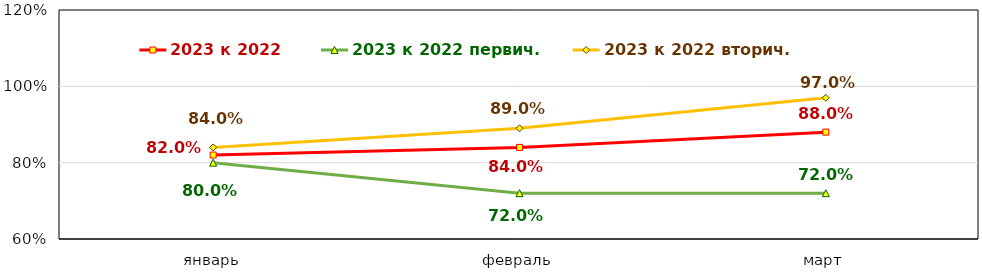
| Category | 2023 к 2022 | 2023 к 2022 первич. | 2023 к 2022 вторич. |
|---|---|---|---|
| январь | 0.82 | 0.8 | 0.84 |
| февраль | 0.84 | 0.72 | 0.89 |
| март | 0.88 | 0.72 | 0.97 |